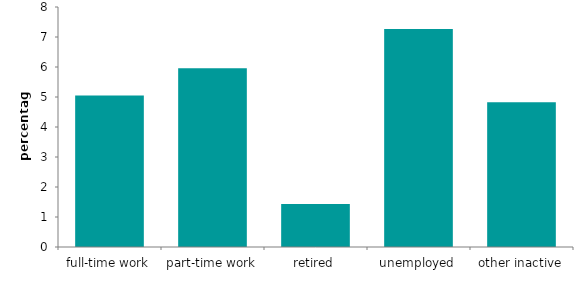
| Category | Series 0 |
|---|---|
| full-time work | 5.05 |
| part-time work | 5.955 |
| retired | 1.429 |
| unemployed | 7.269 |
| other inactive | 4.824 |